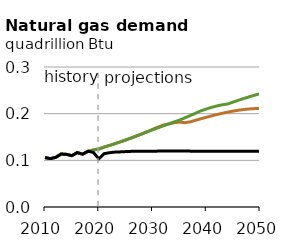
| Category | EAC | DAC | Reference |
|---|---|---|---|
| 2010.0 | 0.106 | 0.106 | 0.106 |
| 2011.0 | 0.104 | 0.104 | 0.104 |
| 2012.0 | 0.106 | 0.106 | 0.106 |
| 2013.0 | 0.114 | 0.114 | 0.114 |
| 2014.0 | 0.113 | 0.113 | 0.113 |
| 2015.0 | 0.11 | 0.11 | 0.11 |
| 2016.0 | 0.117 | 0.117 | 0.117 |
| 2017.0 | 0.113 | 0.113 | 0.113 |
| 2018.0 | 0.119 | 0.119 | 0.119 |
| 2019.0 | 0.122 | 0.122 | 0.117 |
| 2020.0 | 0.124 | 0.124 | 0.103 |
| 2021.0 | 0.128 | 0.128 | 0.114 |
| 2022.0 | 0.132 | 0.132 | 0.116 |
| 2023.0 | 0.136 | 0.136 | 0.118 |
| 2024.0 | 0.14 | 0.139 | 0.118 |
| 2025.0 | 0.144 | 0.143 | 0.119 |
| 2026.0 | 0.148 | 0.148 | 0.119 |
| 2027.0 | 0.152 | 0.152 | 0.119 |
| 2028.0 | 0.157 | 0.156 | 0.119 |
| 2029.0 | 0.161 | 0.161 | 0.12 |
| 2030.0 | 0.166 | 0.165 | 0.12 |
| 2031.0 | 0.171 | 0.17 | 0.12 |
| 2032.0 | 0.176 | 0.174 | 0.12 |
| 2033.0 | 0.178 | 0.178 | 0.12 |
| 2034.0 | 0.181 | 0.182 | 0.12 |
| 2035.0 | 0.182 | 0.186 | 0.12 |
| 2036.0 | 0.181 | 0.191 | 0.12 |
| 2037.0 | 0.182 | 0.196 | 0.12 |
| 2038.0 | 0.186 | 0.201 | 0.12 |
| 2039.0 | 0.189 | 0.206 | 0.12 |
| 2040.0 | 0.192 | 0.21 | 0.12 |
| 2041.0 | 0.195 | 0.214 | 0.12 |
| 2042.0 | 0.198 | 0.217 | 0.12 |
| 2043.0 | 0.201 | 0.219 | 0.12 |
| 2044.0 | 0.203 | 0.221 | 0.12 |
| 2045.0 | 0.205 | 0.225 | 0.12 |
| 2046.0 | 0.207 | 0.229 | 0.12 |
| 2047.0 | 0.209 | 0.233 | 0.12 |
| 2048.0 | 0.21 | 0.236 | 0.12 |
| 2049.0 | 0.211 | 0.24 | 0.12 |
| 2050.0 | 0.211 | 0.243 | 0.12 |